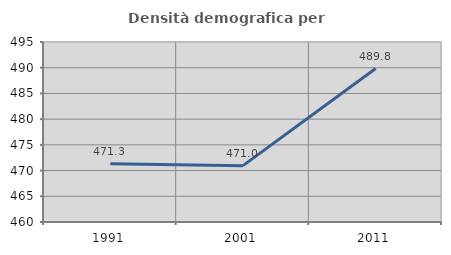
| Category | Densità demografica |
|---|---|
| 1991.0 | 471.307 |
| 2001.0 | 470.957 |
| 2011.0 | 489.832 |